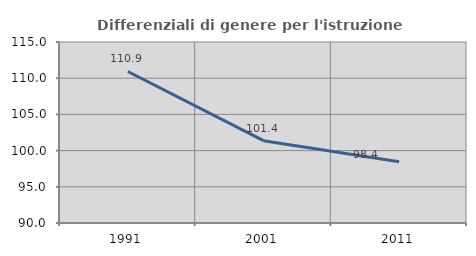
| Category | Differenziali di genere per l'istruzione superiore |
|---|---|
| 1991.0 | 110.93 |
| 2001.0 | 101.373 |
| 2011.0 | 98.446 |